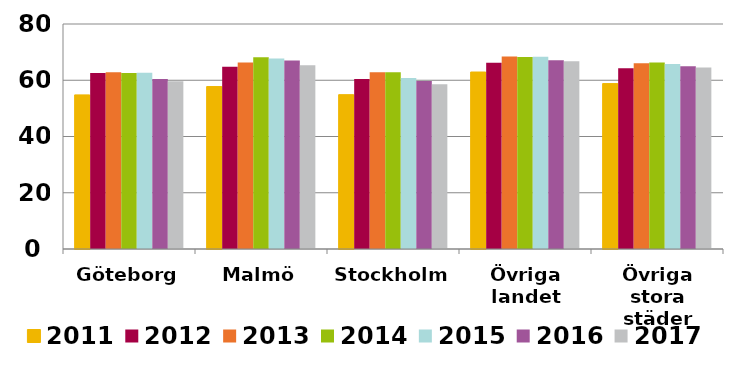
| Category | 2011 | 2012 | 2013 | 2014 | 2015 | 2016 | 2017 |
|---|---|---|---|---|---|---|---|
| Göteborg | 54.795 | 62.551 | 62.844 | 62.536 | 62.637 | 60.426 | 59.605 |
| Malmö | 57.761 | 64.823 | 66.287 | 68.135 | 67.746 | 67.054 | 65.355 |
| Stockholm | 54.876 | 60.411 | 62.824 | 62.83 | 60.781 | 59.735 | 58.537 |
| Övriga landet | 62.924 | 66.247 | 68.449 | 68.256 | 68.316 | 67.103 | 66.721 |
| Övriga stora städer | 58.814 | 64.295 | 66.08 | 66.287 | 65.749 | 65.003 | 64.517 |